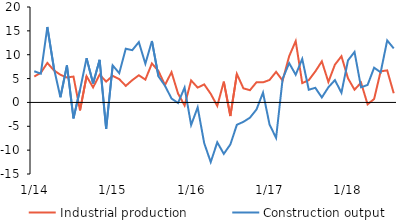
| Category | Industrial production | Construction output |
|---|---|---|
|  1/14 | 5.435 | 6.535 |
| 2 | 6.203 | 6.04 |
| 3 | 8.282 | 15.803 |
| 4 | 6.732 | 7.213 |
| 5 | 5.797 | 1.076 |
| 6 | 5.226 | 7.745 |
| 7 | 5.423 | -3.345 |
| 8 | -1.669 | 2.642 |
| 9 | 5.481 | 9.274 |
| 10 | 3.151 | 3.981 |
| 11 | 5.822 | 8.927 |
| 12 | 4.37 | -5.544 |
|  1/15 | 5.578 | 7.759 |
| 2 | 4.89 | 6.116 |
| 3 | 3.468 | 11.265 |
| 4 | 4.673 | 10.95 |
| 5 | 5.689 | 12.639 |
| 6 | 4.783 | 8.09 |
| 7 | 8.163 | 12.87 |
| 8 | 6.583 | 5.463 |
| 9 | 3.645 | 3.505 |
| 10 | 6.344 | 0.81 |
| 11 | 1.856 | -0.116 |
| 12 | -0.637 | 3.115 |
|  1/16 | 4.608 | -4.732 |
| 2 | 3.106 | -1.034 |
| 3 | 3.783 | -8.533 |
| 4 | 1.799 | -12.506 |
| 5 | -0.727 | -8.357 |
| 6 | 4.352 | -10.781 |
| 7 | -2.847 | -8.809 |
| 8 | 5.968 | -4.683 |
| 9 | 2.948 | -4.069 |
| 10 | 2.563 | -3.198 |
| 11 | 4.227 | -1.485 |
| 12 | 4.203 | 2.056 |
|  1/17 | 4.707 | -4.643 |
| 2 | 6.407 | -7.434 |
| 3 | 4.587 | 4.939 |
| 4 | 9.686 | 8.239 |
| 5 | 12.854 | 5.803 |
| 6 | 4.051 | 9.117 |
| 7 | 4.665 | 2.657 |
| 8 | 6.488 | 3.064 |
| 9 | 8.611 | 1.042 |
| 10 | 4.289 | 3.173 |
| 11 | 7.913 | 4.679 |
| 12 | 9.684 | 2.027 |
|  1/18 | 5.058 | 8.812 |
| 2 | 2.67 | 10.577 |
| 3 | 4.144 | 3.17 |
| 4 | -0.4 | 3.664 |
| 5 | 0.724 | 7.276 |
| 6 | 6.511 | 6.307 |
| 7 | 6.714 | 12.993 |
| 8 | 1.918 | 11.323 |